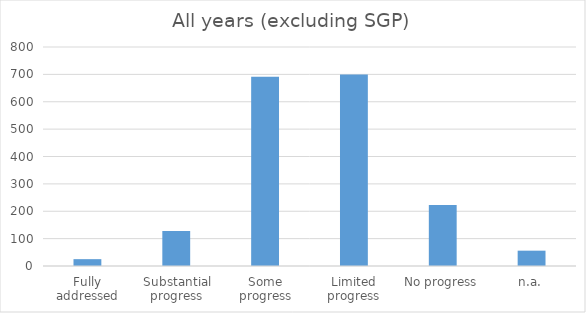
| Category | Total |
|---|---|
| Fully addressed | 25 |
| Substantial progress | 128 |
| Some progress | 691 |
| Limited progress | 700 |
| No progress | 223 |
| n.a. | 56 |